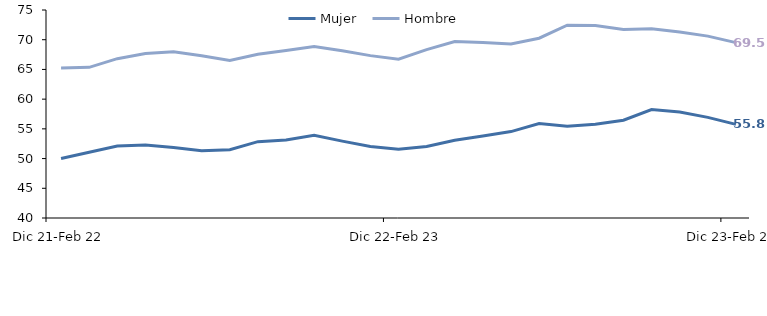
| Category | Mujer | Hombre |
|---|---|---|
| Dic 21-Feb 22 | 50.016 | 65.254 |
| Ene-Mar 2022 | 51.072 | 65.349 |
| Feb-Abr 2022 | 52.097 | 66.809 |
| Mar-May 2022 | 52.266 | 67.674 |
| Abr-Jun 2022 | 51.875 | 67.964 |
| May-Jul 2022 | 51.314 | 67.316 |
| Jun-Ago 2022 | 51.478 | 66.494 |
| Jul-Sep 2022 | 52.843 | 67.538 |
| Ago-Oct 2022 | 53.132 | 68.173 |
| Sep-Nov 2022 | 53.904 | 68.874 |
| Oct-Dic 2022 | 52.933 | 68.129 |
| Nov 22-Ene 23 | 52.016 | 67.324 |
| Dic 22-Feb 23 | 51.553 | 66.71 |
| Ene-Mar 2023 | 52.041 | 68.325 |
| Feb-Abr 2023 | 53.076 | 69.709 |
| Mar-May 2023 | 53.784 | 69.545 |
| Abr-Jun 2023 | 54.54 | 69.281 |
| May-Jul 2023 | 55.91 | 70.252 |
| Jun-Ago 2023 | 55.422 | 72.443 |
| Jul-Sep 2023 | 55.766 | 72.377 |
| Ago-Oct 2023 | 56.445 | 71.703 |
| Sep-Nov 2023 | 58.257 | 71.859 |
| Oct-Dic 2023 | 57.837 | 71.307 |
| Nov 23-Ene 24 | 56.93 | 70.603 |
| Dic 23-Feb 24 | 55.757 | 69.507 |